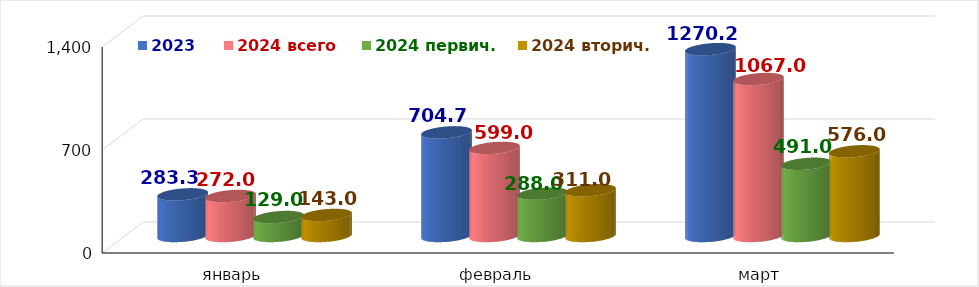
| Category | 2023 | 2024 всего | 2024 первич. | 2024 вторич. |
|---|---|---|---|---|
| январь | 283.333 | 272 | 129 | 143 |
| февраль | 704.706 | 599 | 288 | 311 |
| март | 1270.238 | 1067 | 491 | 576 |